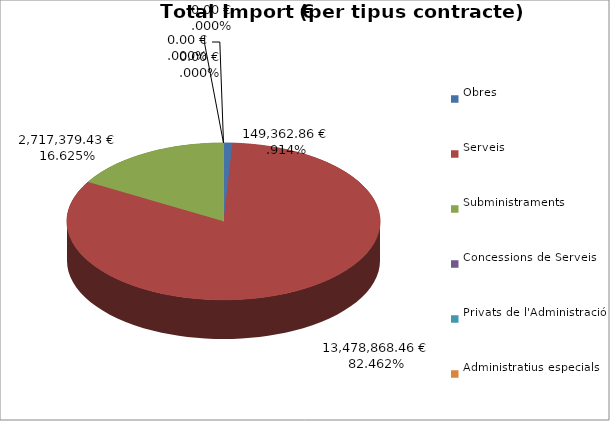
| Category | Total preu
(amb IVA) |
|---|---|
| Obres | 149362.86 |
| Serveis | 13478868.46 |
| Subministraments | 2717379.43 |
| Concessions de Serveis | 0 |
| Privats de l'Administració | 0 |
| Administratius especials | 0 |